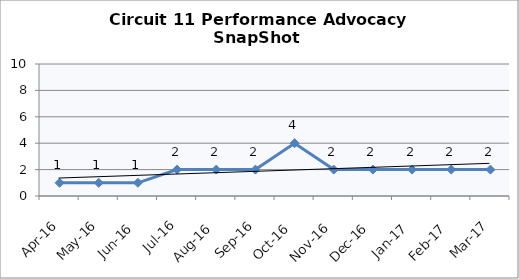
| Category | Circuit 11 |
|---|---|
| Apr-16 | 1 |
| May-16 | 1 |
| Jun-16 | 1 |
| Jul-16 | 2 |
| Aug-16 | 2 |
| Sep-16 | 2 |
| Oct-16 | 4 |
| Nov-16 | 2 |
| Dec-16 | 2 |
| Jan-17 | 2 |
| Feb-17 | 2 |
| Mar-17 | 2 |